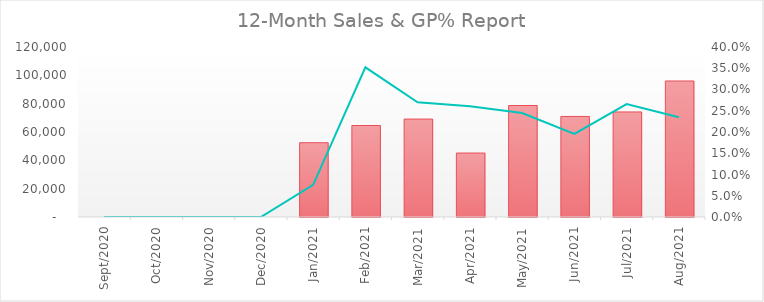
| Category |  Sales  |
|---|---|
| 2021-08-31 | 96020 |
| 2021-07-31 | 74160 |
| 2021-06-30 | 70970 |
| 2021-05-31 | 78700 |
| 2021-04-30 | 45150 |
| 2021-03-31 | 69130 |
| 2021-02-28 | 64580 |
| 2021-01-31 | 52430 |
| 2020-12-31 | 0 |
| 2020-11-30 | 0 |
| 2020-10-31 | 0 |
| 2020-09-30 | 0 |